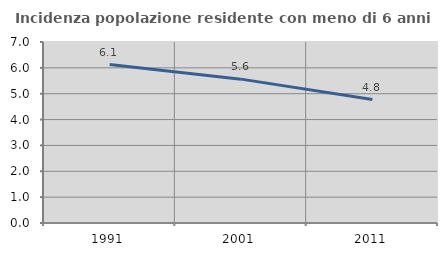
| Category | Incidenza popolazione residente con meno di 6 anni |
|---|---|
| 1991.0 | 6.127 |
| 2001.0 | 5.564 |
| 2011.0 | 4.773 |